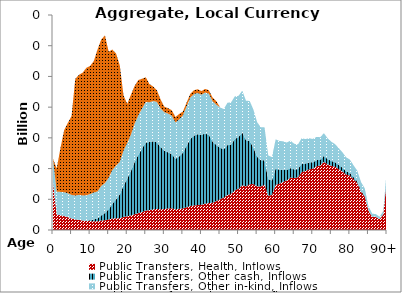
| Category | Public Transfers, Health, Inflows | Public Transfers, Other cash, Inflows | Public Transfers, Other in-kind, Inflows | Public Transfers, Education, Inflows |
|---|---|---|---|---|
| 0 | 31.328 | 0 | 15.057 | 0 |
|  | 9.984 | 0 | 15.022 | 15.096 |
| 2 | 9.68 | 0 | 15.133 | 28.385 |
| 3 | 9.13 | 0 | 15.502 | 40.32 |
| 4 | 8.352 | 0 | 15.577 | 45.808 |
| 5 | 7.512 | 0 | 15.336 | 51.375 |
| 6 | 6.899 | 0 | 15.507 | 76.004 |
| 7 | 6.611 | 0.004 | 16.274 | 78.14 |
| 8 | 6.098 | 0.028 | 16.367 | 79.971 |
| 9 | 5.864 | 0.152 | 16.625 | 82.961 |
| 10 | 5.803 | 0.545 | 17.07 | 83.429 |
| 11 | 5.727 | 1.257 | 17.414 | 85.672 |
| 12 | 5.65 | 1.89 | 17.578 | 92.415 |
| 13 | 6.175 | 3.263 | 19.295 | 95.362 |
| 14 | 6.334 | 4.735 | 19.48 | 96.129 |
| 15 | 6.847 | 6.637 | 20.6 | 82.118 |
| 16 | 7.503 | 9.485 | 22.086 | 78.404 |
| 17 | 7.615 | 12.444 | 21.857 | 72.962 |
| 18 | 7.65 | 15.45 | 21.3 | 62.741 |
| 19 | 8.492 | 20.378 | 22.817 | 35.95 |
| 20 | 8.925 | 24.509 | 23.128 | 25.545 |
| 21 | 9.447 | 29.05 | 23.67 | 25.934 |
| 22 | 10.28 | 34.05 | 24.984 | 24.546 |
| 23 | 11.008 | 38 | 25.762 | 22.898 |
| 24 | 11.723 | 41.396 | 26.034 | 19.352 |
| 25 | 12.61 | 44.309 | 26.472 | 16.056 |
| 26 | 12.979 | 44.293 | 25.921 | 11.791 |
| 27 | 13.462 | 44.345 | 26.166 | 9.429 |
| 28 | 13.742 | 43.363 | 26.3 | 7.58 |
| 29 | 13.502 | 40.41 | 25.281 | 5.729 |
| 30 | 13.625 | 38.154 | 24.943 | 3.554 |
| 31 | 14.064 | 36.497 | 25.242 | 3.557 |
| 32 | 14.116 | 35.322 | 25.007 | 3.555 |
| 33 | 13.462 | 32.872 | 23.692 | 3.543 |
| 34 | 13.782 | 34.125 | 24.11 | 3.547 |
| 35 | 14.032 | 36.241 | 24.388 | 2.463 |
| 36 | 14.826 | 40.056 | 25.606 | 2.474 |
| 37 | 15.628 | 43.71 | 26.852 | 2.485 |
| 38 | 16.013 | 45.424 | 27.103 | 2.487 |
| 39 | 16.242 | 46.166 | 26.75 | 2.484 |
| 40 | 16.396 | 45.514 | 26.205 | 2.337 |
| 41 | 17.146 | 45.704 | 26.684 | 2.341 |
| 42 | 17.539 | 44.338 | 26.865 | 2.343 |
| 43 | 17.741 | 39.884 | 26.285 | 2.337 |
| 44 | 18.828 | 36.532 | 26.269 | 2.337 |
| 45 | 20.06 | 33.528 | 26.283 | 0 |
| 46 | 21.103 | 31.447 | 26.17 | 0 |
| 47 | 22.814 | 32.472 | 27.553 | 0 |
| 48 | 23.619 | 32.113 | 27.459 | 0 |
| 49 | 25.803 | 33.415 | 27.82 | 0 |
| 50 | 26.894 | 33.63 | 26.858 | 0 |
| 51 | 29.134 | 34.333 | 27.318 | 0 |
| 52 | 28.359 | 30.159 | 25.695 | 0 |
| 53 | 29.861 | 28.074 | 26.08 | 0 |
| 54 | 29.884 | 23.787 | 24.774 | 0 |
| 55 | 28.427 | 19.33 | 22.495 | 0 |
| 56 | 28.365 | 17.051 | 21.486 | 0 |
| 57 | 29.579 | 15.88 | 21.403 | 0 |
| 58 | 22.317 | 10.795 | 15.43 | 0 |
| 59 | 22.824 | 9.433 | 15.229 | 0 |
| 60 | 29.484 | 10.492 | 19.058 | 0 |
| 61 | 30.114 | 9.129 | 18.762 | 0 |
| 62 | 31.327 | 7.934 | 18.507 | 0 |
| 63 | 32.283 | 6.768 | 17.912 | 0 |
| 64 | 34.159 | 6.164 | 17.874 | 0 |
| 65 | 33.778 | 5.616 | 16.762 | 0 |
| 66 | 34.293 | 5.374 | 16.09 | 0 |
| 67 | 37.736 | 5.399 | 16.639 | 0 |
| 68 | 38.4 | 4.849 | 15.976 | 0 |
| 69 | 39.518 | 4.529 | 15.693 | 0 |
| 70 | 39.915 | 4.115 | 15.257 | 0 |
| 71 | 41.482 | 3.965 | 15.167 | 0 |
| 72 | 42.013 | 3.803 | 14.625 | 0 |
| 73 | 44.372 | 3.886 | 14.756 | 0 |
| 74 | 42.695 | 3.511 | 13.553 | 0 |
| 75 | 41.769 | 3.149 | 12.552 | 0 |
| 76 | 41.204 | 2.918 | 11.826 | 0 |
| 77 | 39.632 | 2.731 | 10.926 | 0 |
| 78 | 38.066 | 2.464 | 10.056 | 0 |
| 79 | 36.103 | 2.099 | 9.133 | 0 |
| 80 | 35.451 | 1.777 | 8.601 | 0 |
| 81 | 33.007 | 1.374 | 7.702 | 0 |
| 82 | 30.65 | 1.089 | 6.896 | 0 |
| 83 | 24.913 | 0.79 | 5.517 | 0 |
| 84 | 21.81 | 0.621 | 4.762 | 0 |
| 85 | 12.606 | 0.32 | 2.718 | 0 |
| 86 | 8.617 | 0.194 | 1.836 | 0 |
| 87 | 8.405 | 0.168 | 1.769 | 0 |
| 88 | 7.075 | 0.125 | 1.472 | 0 |
| 89 | 10.137 | 0.156 | 2.087 | 0 |
| 90+ | 33.709 | 0.431 | 6.942 | 0 |